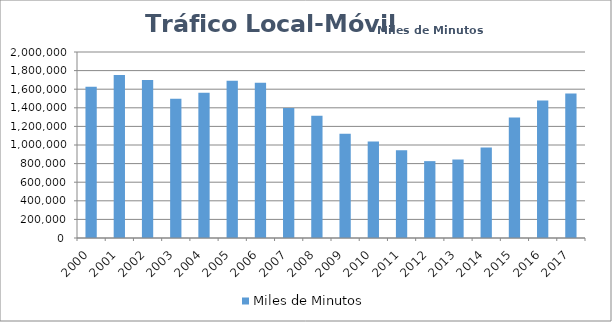
| Category | Miles de Minutos |
|---|---|
| 2000 | 1627028 |
| 2001 | 1752982 |
| 2002 | 1700120 |
| 2003 | 1497591 |
| 2004 | 1562293 |
| 2005 | 1690428 |
| 2006 | 1668463.423 |
| 2007 | 1397811.019 |
| 2008 | 1314507.034 |
| 2009 | 1120321.35 |
| 2010 | 1037043.938 |
| 2011 | 944322.029 |
| 2012 | 826511.145 |
| 2013 | 844044.583 |
| 2014 | 973602.636 |
| 2015 | 1296335.952 |
| 2016 | 1477242.661 |
| 2017 | 1554908.525 |